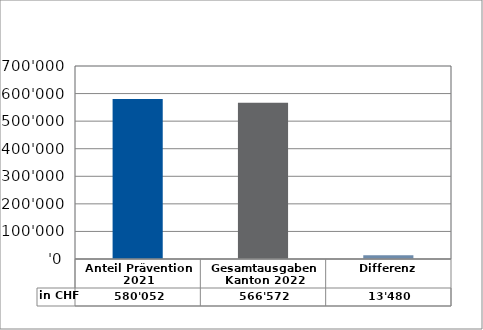
| Category | in CHF |
|---|---|
| Anteil Prävention 2021

 | 580052 |
| Gesamtausgaben Kanton 2022
 | 566572 |
| Differenz | 13480 |